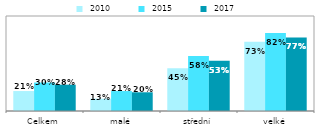
| Category |  2010 |  2015 |  2017 |
|---|---|---|---|
| Celkem | 0.21 | 0.3 | 0.277 |
| malé | 0.13 | 0.21 | 0.197 |
| střední | 0.45 | 0.58 | 0.53 |
| velké | 0.73 | 0.82 | 0.774 |